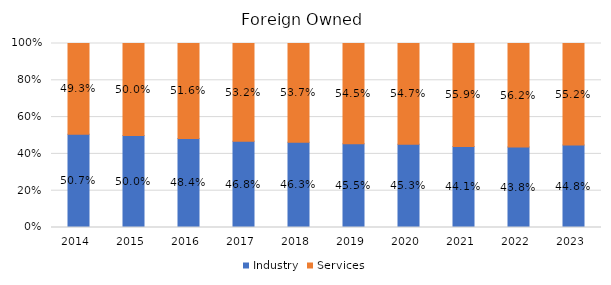
| Category | Industry | Services |
|---|---|---|
| 2014.0 | 0.507 | 0.493 |
| 2015.0 | 0.5 | 0.5 |
| 2016.0 | 0.484 | 0.516 |
| 2017.0 | 0.468 | 0.532 |
| 2018.0 | 0.463 | 0.537 |
| 2019.0 | 0.455 | 0.545 |
| 2020.0 | 0.453 | 0.547 |
| 2021.0 | 0.441 | 0.559 |
| 2022.0 | 0.438 | 0.562 |
| 2023.0 | 0.448 | 0.552 |